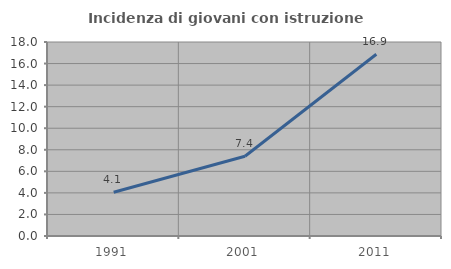
| Category | Incidenza di giovani con istruzione universitaria |
|---|---|
| 1991.0 | 4.054 |
| 2001.0 | 7.396 |
| 2011.0 | 16.864 |